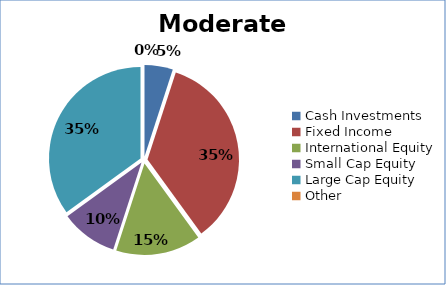
| Category | Cash Investments Fixed Income International Equity Small Cap Equity Large Cap Equity Other |
|---|---|
| Cash Investments | 0.05 |
| Fixed Income | 0.35 |
| International Equity | 0.15 |
| Small Cap Equity | 0.1 |
| Large Cap Equity | 0.35 |
| Other | 0 |